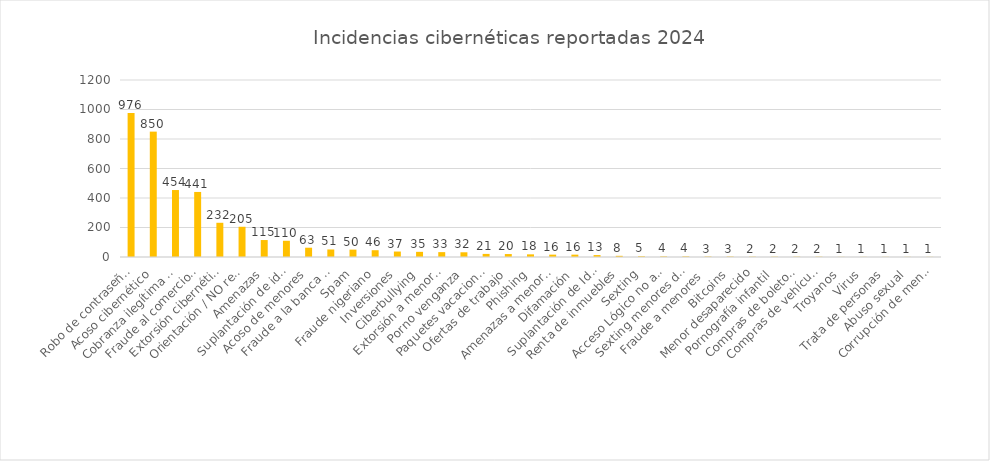
| Category | Series 3 |
|---|---|
| Robo de contraseñas | 976 |
| Acoso cibernético | 850 |
| Cobranza ilegítima a través de amenazas | 454 |
| Fraude al comercio electrónico | 441 |
| Extorsión cibernética | 232 |
| Orientación / NO relacionada con incidentes cibernéticos | 205 |
| Amenazas | 115 |
| Suplantación de identidad | 110 |
| Acoso de menores | 63 |
| Fraude a la banca electrónica | 51 |
| Spam | 50 |
| Fraude nigeriano | 46 |
| Inversiones | 37 |
| Ciberbullying | 35 |
| Extorsión a menores | 33 |
| Porno venganza | 32 |
| Paquetes vacacionales | 21 |
| Ofertas de trabajo | 20 |
| Phishing | 18 |
| Amenazas a menores | 16 |
| Difamación | 16 |
| Suplantación de Identidad | 13 |
| Renta de inmuebles | 8 |
| Sexting | 5 |
| Acceso Lógico no autorizado | 4 |
| Sexting menores de edad | 4 |
| Fraude a menores  | 3 |
| Bitcoins | 3 |
| Menor desaparecido | 2 |
| Pornografía infantil | 2 |
| Compras de boletos de avión  | 2 |
| Compras de vehículos  | 2 |
| Troyanos | 1 |
| Virus | 1 |
| Trata de personas | 1 |
| Abuso sexual | 1 |
| Corrupción de menores | 1 |